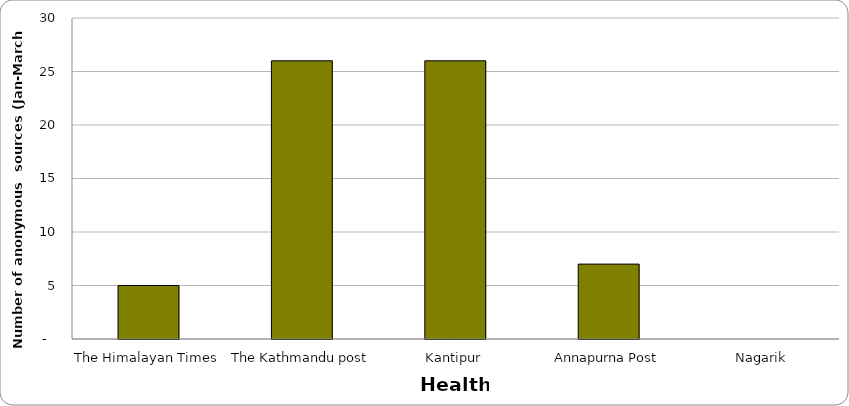
| Category | Health |
|---|---|
| The Himalayan Times | 5 |
| The Kathmandu post | 26 |
| Kantipur | 26 |
| Annapurna Post | 7 |
| Nagarik | 0 |